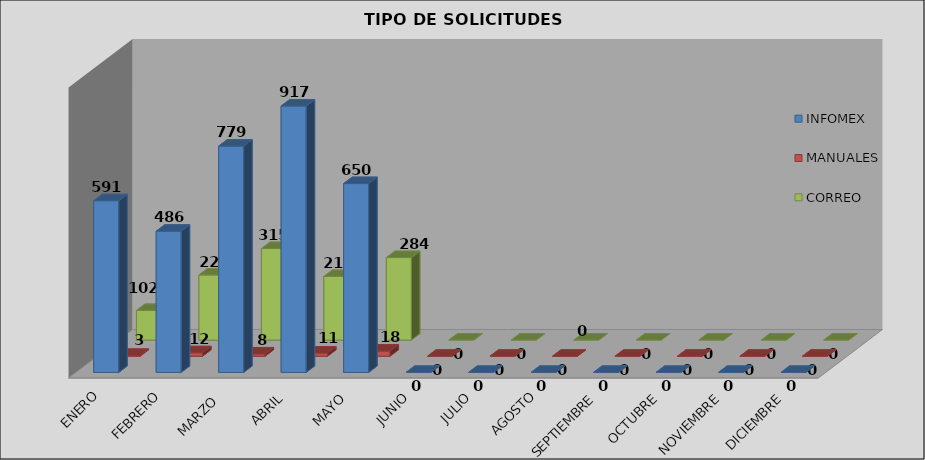
| Category | INFOMEX | MANUALES | CORREO |
|---|---|---|---|
| ENERO | 591 | 3 | 102 |
| FEBRERO | 486 | 12 | 224 |
| MARZO  | 779 | 8 | 315 |
| ABRIL | 917 | 11 | 219 |
| MAYO | 650 | 18 | 284 |
| JUNIO | 0 | 0 | 0 |
| JULIO | 0 | 0 | 0 |
| AGOSTO | 0 | 0 | 0 |
| SEPTIEMBRE | 0 | 0 | 0 |
| OCTUBRE | 0 | 0 | 0 |
| NOVIEMBRE | 0 | 0 | 0 |
| DICIEMBRE | 0 | 0 | 0 |